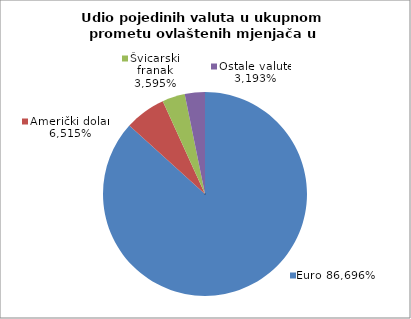
| Category | EUR |
|---|---|
| 0 | 0.867 |
| 1 | 0.065 |
| 2 | 0.036 |
| 3 | 0.032 |